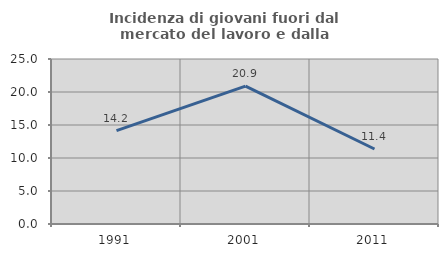
| Category | Incidenza di giovani fuori dal mercato del lavoro e dalla formazione  |
|---|---|
| 1991.0 | 14.16 |
| 2001.0 | 20.882 |
| 2011.0 | 11.361 |